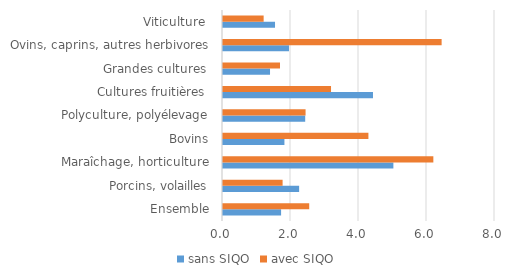
| Category | sans SIQO | avec SIQO |
|---|---|---|
| Ensemble | 1.709 | 2.536 |
| Porcins, volailles | 2.239 | 1.753 |
| Maraîchage, horticulture | 5.011 | 6.187 |
| Bovins | 1.807 | 4.277 |
| Polyculture, polyélevage | 2.418 | 2.429 |
| Cultures fruitières  | 4.411 | 3.177 |
| Grandes cultures  | 1.383 | 1.677 |
| Ovins, caprins, autres herbivores | 1.941 | 6.43 |
| Viticulture  | 1.53 | 1.195 |